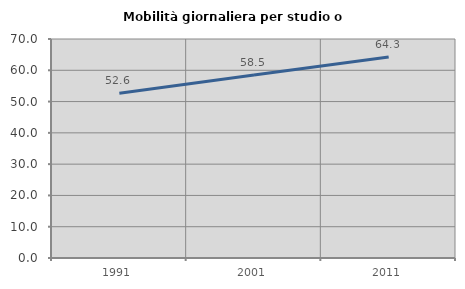
| Category | Mobilità giornaliera per studio o lavoro |
|---|---|
| 1991.0 | 52.642 |
| 2001.0 | 58.512 |
| 2011.0 | 64.27 |